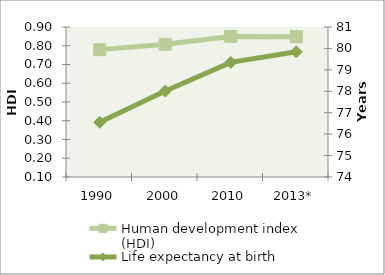
| Category | Human development index (HDI) |
|---|---|
| 1990 | 0.779 |
| 2000 | 0.808 |
| 2010 | 0.849 |
| 2013* | 0.848 |